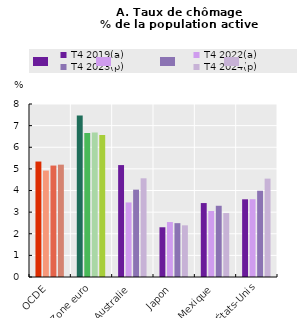
| Category | T4 2019(a) | T4 2022(a) | T4 2023(p) | T4 2024(p) |
|---|---|---|---|---|
| OCDE | 5.339 | 4.922 | 5.154 | 5.195 |
| Zone euro | 7.468 | 6.663 | 6.687 | 6.568 |
| Australie | 5.176 | 3.448 | 4.039 | 4.564 |
| Japon | 2.3 | 2.541 | 2.49 | 2.39 |
| Mexique | 3.42 | 3.053 | 3.294 | 2.957 |
| États-Unis | 3.593 | 3.597 | 3.989 | 4.549 |